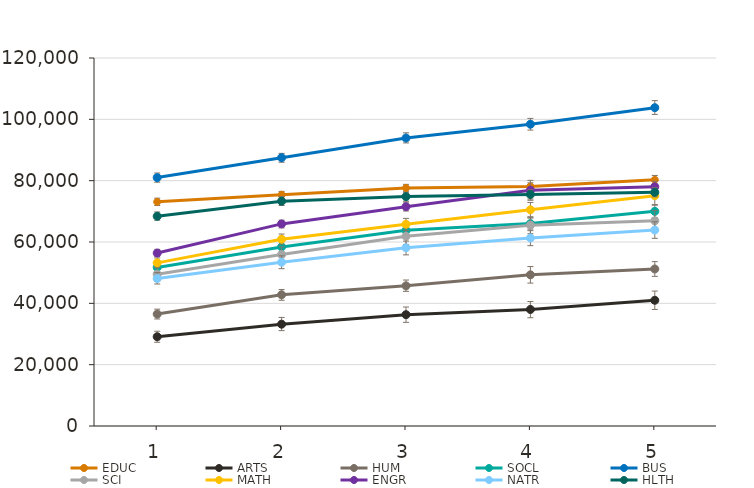
| Category | EDUC | ARTS | HUM | SOCL | BUS | SCI | MATH | ENGR | NATR | HLTH |
|---|---|---|---|---|---|---|---|---|---|---|
| 1.0 | 73100 | 29100 | 36500 | 51700 | 81000 | 49500 | 53200 | 56400 | 48100 | 68400 |
| 2.0 | 75400 | 33200 | 42800 | 58400 | 87500 | 55900 | 60900 | 65900 | 53400 | 73300 |
| 3.0 | 77600 | 36300 | 45700 | 63800 | 93900 | 61900 | 65800 | 71500 | 58100 | 74800 |
| 4.0 | 78100 | 38000 | 49300 | 66000 | 98400 | 65500 | 70500 | 76900 | 61300 | 75500 |
| 5.0 | 80300 | 41000 | 51200 | 70000 | 103800 | 66900 | 75100 | 78000 | 63900 | 76200 |